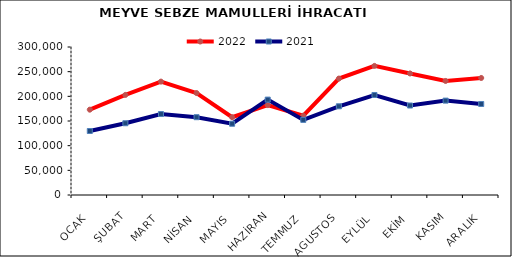
| Category | 2022 | 2021 |
|---|---|---|
| OCAK | 172966.688 | 129703.741 |
| ŞUBAT | 202863.345 | 145442.874 |
| MART | 229835.914 | 164140.009 |
| NİSAN | 206688.717 | 157710.707 |
| MAYIS | 157721.861 | 144432.522 |
| HAZİRAN | 182252.029 | 193334.149 |
| TEMMUZ | 160742.929 | 152303.132 |
| AGUSTOS | 235990.35 | 179835.282 |
| EYLÜL | 261700.059 | 202730.963 |
| EKİM | 246363.909 | 181364.353 |
| KASIM | 231174.593 | 191293.86 |
| ARALIK | 237238.506 | 184486.583 |